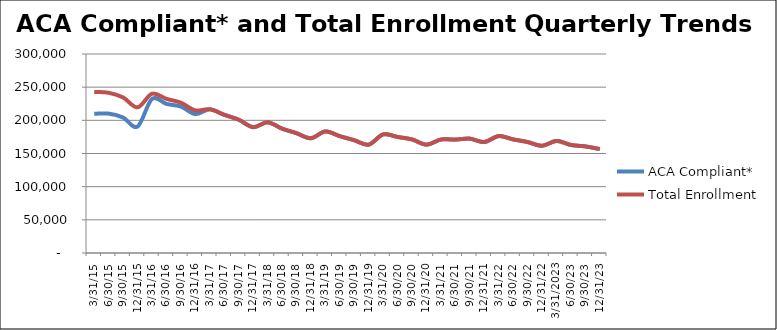
| Category | ACA Compliant* | Total Enrollment |
|---|---|---|
| 3/31/15 | 209846 | 242775 |
| 6/30/15 | 210138 | 241510 |
| 9/30/15 | 204187 | 234480 |
| 12/31/15 | 190658 | 219578 |
| 3/31/16 | 232146 | 240046 |
| 6/30/16 | 224791 | 232362 |
| 9/30/16 | 220749 | 226644 |
| 12/31/16 | 209370 | 214929 |
| 3/31/17 | 216569 | 216716 |
| 6/30/17 | 208262 | 208404 |
| 9/30/17 | 200919 | 201056 |
| 12/31/17 | 189622 | 189747 |
| 3/31/18 | 196944 | 197037 |
| 6/30/18 | 187440 | 187569 |
| 9/30/18 | 180566 | 180690 |
| 12/31/18 | 172952 | 173077 |
| 3/31/19 | 183180 | 183289 |
| 6/30/19 | 176057 | 176164 |
| 9/30/19 | 169957 | 170087 |
| 12/31/19 | 163311 | 163437 |
| 3/31/20 | 178696 | 178821 |
| 6/30/20 | 174851 | 174972 |
| 9/30/20 | 171164 | 171286 |
| 12/31/20 | 163305 | 163422 |
| 3/31/21 | 170986 | 171102 |
| 6/30/21 | 170896 | 171007 |
| 9/30/21 | 172345 | 172453 |
| 12/31/21 | 167215 | 167321 |
| 3/31/22 | 176211 | 176312 |
| 6/30/22 | 171237 | 171337 |
| 9/30/22 | 167270 | 167369 |
| 12/31/22 | 161581 | 161679 |
| 3/31/2023 | 168896 | 168993 |
| 6/30/23 | 162832 | 162929 |
| 9/30/23 | 160626 | 160723 |
| 12/31/23 | 156639 | 156735 |